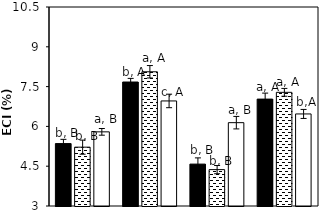
| Category |    A. brasilense |    A. chroococcum |    CK |
|---|---|---|---|
| aCO2-Bt | 5.352 | 5.217 | 5.795 |
| aCO2-XIANYU | 7.672 | 8.059 | 6.959 |
| eCO2-Bt | 4.579 | 4.371 | 6.141 |
| eCO2-XIANYU | 7.029 | 7.284 | 6.47 |